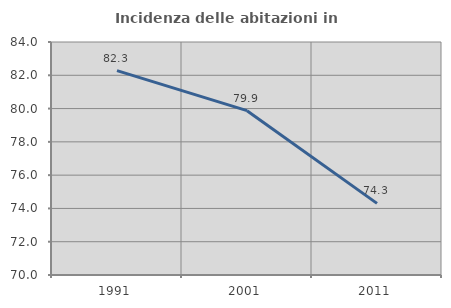
| Category | Incidenza delle abitazioni in proprietà  |
|---|---|
| 1991.0 | 82.278 |
| 2001.0 | 79.874 |
| 2011.0 | 74.303 |